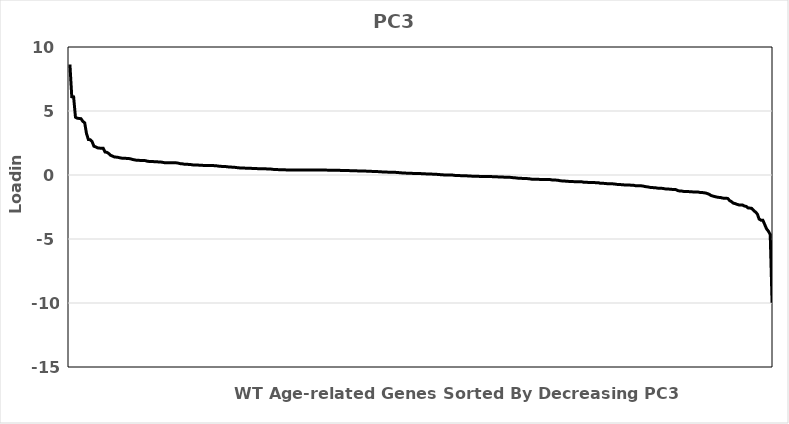
| Category | Series 0 |
|---|---|
| 0 | 8.631 |
| 1 | 6.117 |
| 2 | 6.104 |
| 3 | 4.513 |
| 4 | 4.434 |
| 5 | 4.417 |
| 6 | 4.398 |
| 7 | 4.189 |
| 8 | 4.075 |
| 9 | 3.22 |
| 10 | 2.772 |
| 11 | 2.756 |
| 12 | 2.607 |
| 13 | 2.242 |
| 14 | 2.196 |
| 15 | 2.118 |
| 16 | 2.102 |
| 17 | 2.086 |
| 18 | 2.084 |
| 19 | 1.799 |
| 20 | 1.771 |
| 21 | 1.678 |
| 22 | 1.539 |
| 23 | 1.482 |
| 24 | 1.413 |
| 25 | 1.398 |
| 26 | 1.379 |
| 27 | 1.345 |
| 28 | 1.317 |
| 29 | 1.309 |
| 30 | 1.309 |
| 31 | 1.285 |
| 32 | 1.283 |
| 33 | 1.255 |
| 34 | 1.211 |
| 35 | 1.183 |
| 36 | 1.152 |
| 37 | 1.149 |
| 38 | 1.139 |
| 39 | 1.137 |
| 40 | 1.137 |
| 41 | 1.116 |
| 42 | 1.068 |
| 43 | 1.061 |
| 44 | 1.061 |
| 45 | 1.05 |
| 46 | 1.035 |
| 47 | 1.03 |
| 48 | 1.022 |
| 49 | 1.015 |
| 50 | 0.996 |
| 51 | 0.967 |
| 52 | 0.958 |
| 53 | 0.955 |
| 54 | 0.952 |
| 55 | 0.952 |
| 56 | 0.952 |
| 57 | 0.952 |
| 58 | 0.945 |
| 59 | 0.913 |
| 60 | 0.875 |
| 61 | 0.869 |
| 62 | 0.842 |
| 63 | 0.84 |
| 64 | 0.83 |
| 65 | 0.827 |
| 66 | 0.798 |
| 67 | 0.782 |
| 68 | 0.779 |
| 69 | 0.773 |
| 70 | 0.77 |
| 71 | 0.765 |
| 72 | 0.751 |
| 73 | 0.747 |
| 74 | 0.744 |
| 75 | 0.74 |
| 76 | 0.738 |
| 77 | 0.735 |
| 78 | 0.732 |
| 79 | 0.721 |
| 80 | 0.707 |
| 81 | 0.679 |
| 82 | 0.673 |
| 83 | 0.672 |
| 84 | 0.666 |
| 85 | 0.644 |
| 86 | 0.628 |
| 87 | 0.624 |
| 88 | 0.606 |
| 89 | 0.602 |
| 90 | 0.584 |
| 91 | 0.564 |
| 92 | 0.553 |
| 93 | 0.547 |
| 94 | 0.543 |
| 95 | 0.535 |
| 96 | 0.53 |
| 97 | 0.524 |
| 98 | 0.524 |
| 99 | 0.507 |
| 100 | 0.501 |
| 101 | 0.5 |
| 102 | 0.495 |
| 103 | 0.493 |
| 104 | 0.488 |
| 105 | 0.487 |
| 106 | 0.48 |
| 107 | 0.474 |
| 108 | 0.469 |
| 109 | 0.46 |
| 110 | 0.439 |
| 111 | 0.436 |
| 112 | 0.421 |
| 113 | 0.419 |
| 114 | 0.411 |
| 115 | 0.41 |
| 116 | 0.408 |
| 117 | 0.399 |
| 118 | 0.398 |
| 119 | 0.397 |
| 120 | 0.397 |
| 121 | 0.397 |
| 122 | 0.397 |
| 123 | 0.397 |
| 124 | 0.396 |
| 125 | 0.394 |
| 126 | 0.394 |
| 127 | 0.393 |
| 128 | 0.393 |
| 129 | 0.387 |
| 130 | 0.387 |
| 131 | 0.386 |
| 132 | 0.385 |
| 133 | 0.385 |
| 134 | 0.385 |
| 135 | 0.385 |
| 136 | 0.384 |
| 137 | 0.384 |
| 138 | 0.383 |
| 139 | 0.381 |
| 140 | 0.38 |
| 141 | 0.378 |
| 142 | 0.376 |
| 143 | 0.374 |
| 144 | 0.373 |
| 145 | 0.369 |
| 146 | 0.362 |
| 147 | 0.356 |
| 148 | 0.356 |
| 149 | 0.354 |
| 150 | 0.347 |
| 151 | 0.344 |
| 152 | 0.336 |
| 153 | 0.335 |
| 154 | 0.33 |
| 155 | 0.327 |
| 156 | 0.317 |
| 157 | 0.31 |
| 158 | 0.308 |
| 159 | 0.306 |
| 160 | 0.306 |
| 161 | 0.298 |
| 162 | 0.296 |
| 163 | 0.284 |
| 164 | 0.281 |
| 165 | 0.278 |
| 166 | 0.266 |
| 167 | 0.263 |
| 168 | 0.256 |
| 169 | 0.241 |
| 170 | 0.234 |
| 171 | 0.233 |
| 172 | 0.223 |
| 173 | 0.22 |
| 174 | 0.219 |
| 175 | 0.214 |
| 176 | 0.211 |
| 177 | 0.197 |
| 178 | 0.185 |
| 179 | 0.175 |
| 180 | 0.158 |
| 181 | 0.157 |
| 182 | 0.145 |
| 183 | 0.144 |
| 184 | 0.134 |
| 185 | 0.132 |
| 186 | 0.116 |
| 187 | 0.111 |
| 188 | 0.111 |
| 189 | 0.108 |
| 190 | 0.108 |
| 191 | 0.104 |
| 192 | 0.099 |
| 193 | 0.079 |
| 194 | 0.078 |
| 195 | 0.077 |
| 196 | 0.069 |
| 197 | 0.062 |
| 198 | 0.05 |
| 199 | 0.048 |
| 200 | 0.036 |
| 201 | 0.014 |
| 202 | 0.01 |
| 203 | 0.006 |
| 204 | -0.001 |
| 205 | -0.002 |
| 206 | -0.002 |
| 207 | -0.005 |
| 208 | -0.023 |
| 209 | -0.046 |
| 210 | -0.048 |
| 211 | -0.048 |
| 212 | -0.053 |
| 213 | -0.057 |
| 214 | -0.066 |
| 215 | -0.067 |
| 216 | -0.08 |
| 217 | -0.086 |
| 218 | -0.092 |
| 219 | -0.099 |
| 220 | -0.105 |
| 221 | -0.106 |
| 222 | -0.109 |
| 223 | -0.109 |
| 224 | -0.11 |
| 225 | -0.116 |
| 226 | -0.119 |
| 227 | -0.119 |
| 228 | -0.124 |
| 229 | -0.132 |
| 230 | -0.14 |
| 231 | -0.146 |
| 232 | -0.147 |
| 233 | -0.156 |
| 234 | -0.164 |
| 235 | -0.167 |
| 236 | -0.172 |
| 237 | -0.174 |
| 238 | -0.181 |
| 239 | -0.192 |
| 240 | -0.214 |
| 241 | -0.218 |
| 242 | -0.244 |
| 243 | -0.246 |
| 244 | -0.256 |
| 245 | -0.27 |
| 246 | -0.276 |
| 247 | -0.281 |
| 248 | -0.285 |
| 249 | -0.305 |
| 250 | -0.331 |
| 251 | -0.332 |
| 252 | -0.34 |
| 253 | -0.342 |
| 254 | -0.342 |
| 255 | -0.344 |
| 256 | -0.349 |
| 257 | -0.35 |
| 258 | -0.355 |
| 259 | -0.358 |
| 260 | -0.36 |
| 261 | -0.392 |
| 262 | -0.397 |
| 263 | -0.399 |
| 264 | -0.405 |
| 265 | -0.44 |
| 266 | -0.459 |
| 267 | -0.466 |
| 268 | -0.477 |
| 269 | -0.491 |
| 270 | -0.5 |
| 271 | -0.503 |
| 272 | -0.516 |
| 273 | -0.519 |
| 274 | -0.519 |
| 275 | -0.519 |
| 276 | -0.522 |
| 277 | -0.53 |
| 278 | -0.563 |
| 279 | -0.564 |
| 280 | -0.574 |
| 281 | -0.584 |
| 282 | -0.584 |
| 283 | -0.591 |
| 284 | -0.595 |
| 285 | -0.6 |
| 286 | -0.6 |
| 287 | -0.651 |
| 288 | -0.651 |
| 289 | -0.654 |
| 290 | -0.66 |
| 291 | -0.691 |
| 292 | -0.691 |
| 293 | -0.693 |
| 294 | -0.693 |
| 295 | -0.708 |
| 296 | -0.731 |
| 297 | -0.748 |
| 298 | -0.751 |
| 299 | -0.756 |
| 300 | -0.776 |
| 301 | -0.785 |
| 302 | -0.785 |
| 303 | -0.787 |
| 304 | -0.8 |
| 305 | -0.802 |
| 306 | -0.833 |
| 307 | -0.837 |
| 308 | -0.844 |
| 309 | -0.846 |
| 310 | -0.856 |
| 311 | -0.896 |
| 312 | -0.916 |
| 313 | -0.936 |
| 314 | -0.968 |
| 315 | -0.968 |
| 316 | -0.995 |
| 317 | -0.999 |
| 318 | -1.026 |
| 319 | -1.04 |
| 320 | -1.041 |
| 321 | -1.049 |
| 322 | -1.083 |
| 323 | -1.089 |
| 324 | -1.099 |
| 325 | -1.111 |
| 326 | -1.127 |
| 327 | -1.127 |
| 328 | -1.144 |
| 329 | -1.222 |
| 330 | -1.247 |
| 331 | -1.251 |
| 332 | -1.281 |
| 333 | -1.295 |
| 334 | -1.298 |
| 335 | -1.298 |
| 336 | -1.312 |
| 337 | -1.319 |
| 338 | -1.321 |
| 339 | -1.321 |
| 340 | -1.331 |
| 341 | -1.364 |
| 342 | -1.364 |
| 343 | -1.389 |
| 344 | -1.405 |
| 345 | -1.451 |
| 346 | -1.511 |
| 347 | -1.606 |
| 348 | -1.647 |
| 349 | -1.685 |
| 350 | -1.724 |
| 351 | -1.748 |
| 352 | -1.75 |
| 353 | -1.796 |
| 354 | -1.817 |
| 355 | -1.817 |
| 356 | -1.831 |
| 357 | -1.993 |
| 358 | -2.078 |
| 359 | -2.199 |
| 360 | -2.231 |
| 361 | -2.292 |
| 362 | -2.335 |
| 363 | -2.339 |
| 364 | -2.344 |
| 365 | -2.425 |
| 366 | -2.451 |
| 367 | -2.574 |
| 368 | -2.585 |
| 369 | -2.607 |
| 370 | -2.767 |
| 371 | -2.891 |
| 372 | -3.042 |
| 373 | -3.443 |
| 374 | -3.531 |
| 375 | -3.532 |
| 376 | -3.86 |
| 377 | -4.205 |
| 378 | -4.383 |
| 379 | -4.658 |
| 380 | -9.972 |